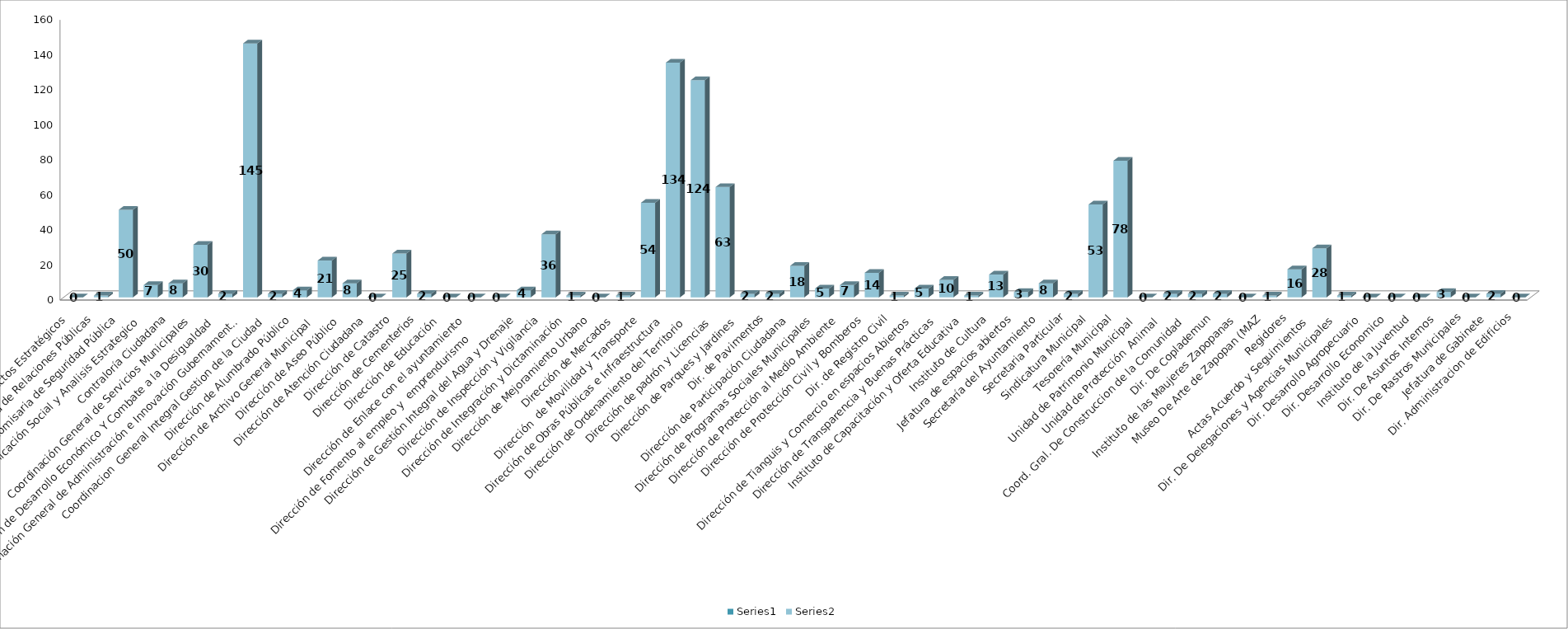
| Category | Series 0 | Series 1 |
|---|---|---|
| Area de Proyectos Estratégicos |  | 0 |
| Área de Relaciones Públicas |  | 1 |
| Comisaria de Seguridad Pública |  | 50 |
| Comunicación Social y Analisis Estrategico  |  | 7 |
| Contraloría Ciudadana |  | 8 |
| Coordinación General de Servicios Municipales |  | 30 |
| Coordinación de Desarrollo Económico Y Combate a la Desigualdad |  | 2 |
| Coordinación General de Administración e Innovación Gubernamental |  | 145 |
| Coordinacion  General Integral Gestion de la Ciudad |  | 2 |
| Dirección de Alumbrado Público |  | 4 |
| Dirección de Archivo General Municipal  |  | 21 |
| Dirección de Aseo Público  |  | 8 |
| Dirección de Atención Ciudadana |  | 0 |
| Dirección de Catastro |  | 25 |
| Dirección de Cementerios |  | 2 |
| Dirección de Educación  |  | 0 |
| Dirección de Enlace con el ayuntamiento |  | 0 |
| Dirección de Fomento al empleo y  emprendurismo         |  | 0 |
| Dirección de Gestión Integral del Agua y Drenaje |  | 4 |
| Dirección de Inspección y Vigilancia |  | 36 |
| Dirección de Integración y Dictaminación |  | 1 |
| Dirección de Mejoramiento Urbano |  | 0 |
| Dirección de Mercados  |  | 1 |
| Dirección  de Movilidad y Transporte |  | 54 |
| Dirección de Obras Públicas e Infraestructura |  | 134 |
| Dirección de Ordenamiento del Territorio  |  | 124 |
| Dirección de padrón y Licencias  |  | 63 |
| Dirección de Parques y Jardines  |  | 2 |
| Dir. de Pavimentos |  | 2 |
| Dirección de Participación Ciudadana |  | 18 |
| Dirección de Programas Sociales Municipales |  | 5 |
| Dirección de Protección al Medio Ambiente  |  | 7 |
| Dirección de Protección Civil y Bomberos |  | 14 |
| Dir. de Registro Civil |  | 1 |
| Dirección de Tianguis y Comercio en espacios Abiertos |  | 5 |
| Dirección de Transparencia y Buenas Prácticas |  | 10 |
| Instituto de Capacitación y Oferta Educativa |  | 1 |
| Instituto de Cultura  |  | 13 |
| Jefatura de espacios abiertos |  | 3 |
| Secretaría del Ayuntamiento |  | 8 |
| Secretaria Particular |  | 2 |
| Sindicatura Municipal |  | 53 |
| Tesorería Municipal |  | 78 |
| Unidad de Patrimonio Municipal  |  | 0 |
| Unidad de Protección  Animal  |  | 2 |
| Coord. Gral. De Construccion de la Comunidad |  | 2 |
| Dir. De Coplademun |  | 2 |
| Instituto de las Maujeres Zapopanas |  | 0 |
| Museo De Arte de Zapopan (MAZ |  | 1 |
| Regidores |  | 16 |
| Actas Acuerdo y Seguimientos  |  | 28 |
| Dir. De Delegaciones y Agencias Municipales |  | 1 |
|  Dir. Desarrollo Agropecuario |  | 0 |
| Dir. Desarrollo Economico |  | 0 |
| Instituto de la Juventud |  | 0 |
| Dir. De Asuntos Internos |  | 3 |
| Dir. De Rastros Municipales |  | 0 |
| Jefatura de Gabinete |  | 2 |
| Dir. Administracion de Edificios |  | 0 |